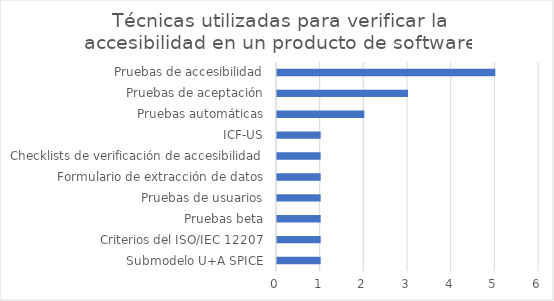
| Category | Frecuencia |
|---|---|
| Submodelo U+A SPICE | 1 |
| Criterios del ISO/IEC 12207 | 1 |
| Pruebas beta | 1 |
| Pruebas de usuarios | 1 |
| Formulario de extracción de datos | 1 |
| Checklists de verificación de accesibilidad | 1 |
| ICF-US | 1 |
| Pruebas automáticas | 2 |
| Pruebas de aceptación | 3 |
| Pruebas de accesibilidad | 5 |